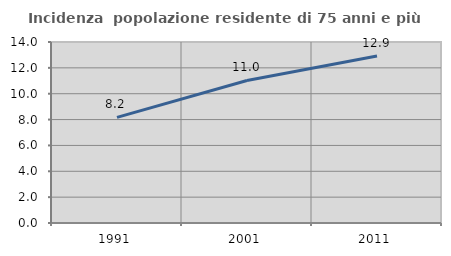
| Category | Incidenza  popolazione residente di 75 anni e più |
|---|---|
| 1991.0 | 8.167 |
| 2001.0 | 11.027 |
| 2011.0 | 12.916 |